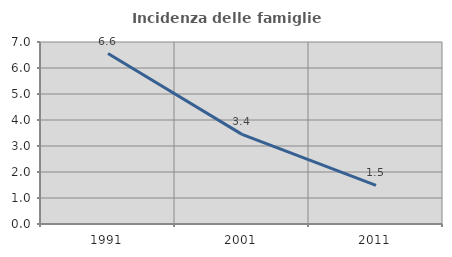
| Category | Incidenza delle famiglie numerose |
|---|---|
| 1991.0 | 6.557 |
| 2001.0 | 3.448 |
| 2011.0 | 1.485 |